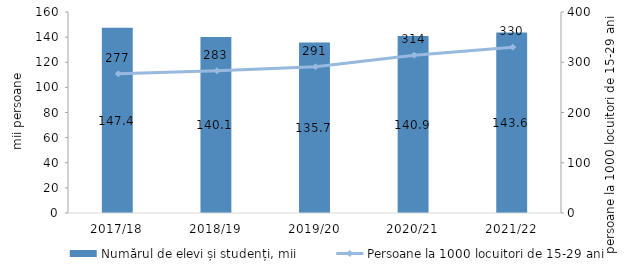
| Category | Numărul de elevi și studenți, mii |
|---|---|
| 2017/18 | 147.4 |
| 2018/19 | 140.1 |
| 2019/20 | 135.7 |
| 2020/21 | 140.9 |
| 2021/22 | 143.6 |